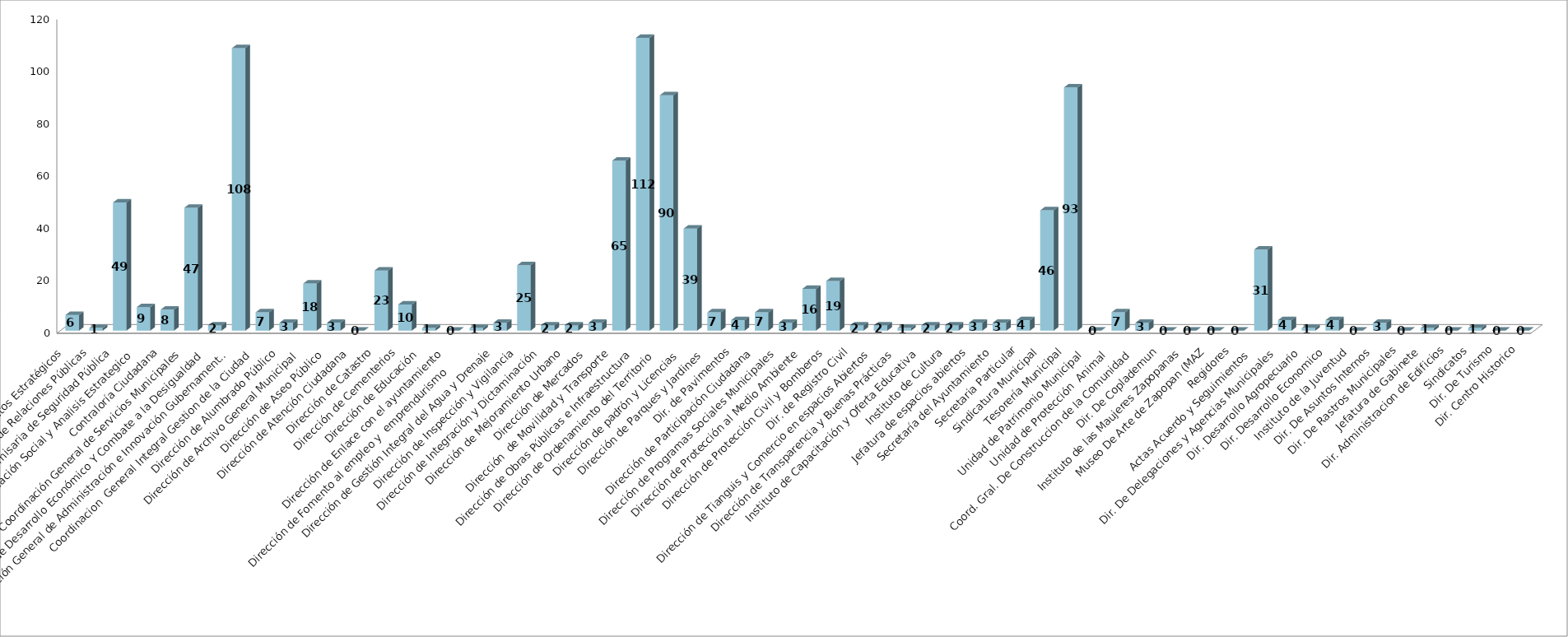
| Category | Series 0 | Series 1 |
|---|---|---|
| Area de Proyectos Estratégicos |  | 6 |
| Área de Relaciones Públicas |  | 1 |
| Comisaria de Seguridad Pública |  | 49 |
| Comunicación Social y Analisis Estrategico  |  | 9 |
| Contraloría Ciudadana |  | 8 |
| Coordinación General de Servicios Municipales |  | 47 |
| Coordinación de Desarrollo Económico Y Combate a la Desigualdad |  | 2 |
| Coordinación General de Administración e Innovación Gubernamental |  | 108 |
| Coordinacion  General Integral Gestion de la Ciudad |  | 7 |
| Dirección de Alumbrado Público |  | 3 |
| Dirección de Archivo General Municipal  |  | 18 |
| Dirección de Aseo Público  |  | 3 |
| Dirección de Atención Ciudadana |  | 0 |
| Dirección de Catastro |  | 23 |
| Dirección de Cementerios |  | 10 |
| Dirección de Educación  |  | 1 |
| Dirección de Enlace con el ayuntamiento |  | 0 |
| Dirección de Fomento al empleo y  emprendurismo         |  | 1 |
| Dirección de Gestión Integral del Agua y Drenaje |  | 3 |
| Dirección de Inspección y Vigilancia |  | 25 |
| Dirección de Integración y Dictaminación |  | 2 |
| Dirección de Mejoramiento Urbano |  | 2 |
| Dirección de Mercados  |  | 3 |
| Dirección  de Movilidad y Transporte |  | 65 |
| Dirección de Obras Públicas e Infraestructura |  | 112 |
| Dirección de Ordenamiento del Territorio  |  | 90 |
| Dirección de padrón y Licencias  |  | 39 |
| Dirección de Parques y Jardines  |  | 7 |
| Dir. de Pavimentos |  | 4 |
| Dirección de Participación Ciudadana |  | 7 |
| Dirección de Programas Sociales Municipales |  | 3 |
| Dirección de Protección al Medio Ambiente  |  | 16 |
| Dirección de Protección Civil y Bomberos |  | 19 |
| Dir. de Registro Civil |  | 2 |
| Dirección de Tianguis y Comercio en espacios Abiertos |  | 2 |
| Dirección de Transparencia y Buenas Prácticas |  | 1 |
| Instituto de Capacitación y Oferta Educativa |  | 2 |
| Instituto de Cultura  |  | 2 |
| Jefatura de espacios abiertos |  | 3 |
| Secretaría del Ayuntamiento |  | 3 |
| Secretaria Particular |  | 4 |
| Sindicatura Municipal |  | 46 |
| Tesorería Municipal |  | 93 |
| Unidad de Patrimonio Municipal  |  | 0 |
| Unidad de Protección  Animal  |  | 7 |
| Coord. Gral. De Construccion de la Comunidad |  | 3 |
| Dir. De Coplademun |  | 0 |
| Instituto de las Maujeres Zapopanas |  | 0 |
| Museo De Arte de Zapopan (MAZ |  | 0 |
| Regidores |  | 0 |
| Actas Acuerdo y Seguimientos  |  | 31 |
| Dir. De Delegaciones y Agencias Municipales |  | 4 |
|  Dir. Desarrollo Agropecuario |  | 1 |
| Dir. Desarrollo Economico |  | 4 |
| Instituto de la Juventud |  | 0 |
| Dir. De Asuntos Internos |  | 3 |
| Dir. De Rastros Municipales |  | 0 |
| Jefatura de Gabinete |  | 1 |
| Dir. Administracion de Edificios |  | 0 |
| Sindicatos |  | 1 |
| Dir. De Turismo |  | 0 |
| Dir. Centro Historico |  | 0 |